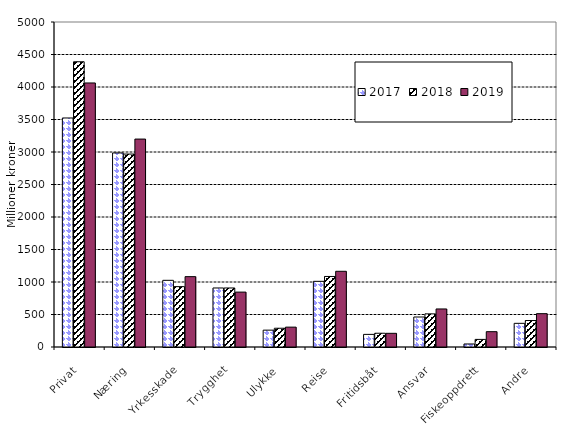
| Category | 2017 | 2018 | 2019 |
|---|---|---|---|
| Privat | 3523.339 | 4388.265 | 4062.098 |
| Næring | 2985.487 | 2968.497 | 3198.952 |
| Yrkesskade | 1025.826 | 928.785 | 1082.429 |
| Trygghet | 908.118 | 908.027 | 844.528 |
| Ulykke | 259.137 | 288.488 | 305.606 |
| Reise | 1010.192 | 1085.106 | 1164.677 |
| Fritidsbåt | 194.097 | 211.627 | 210.512 |
| Ansvar | 461.433 | 509.757 | 585.276 |
| Fiskeoppdrett | 46.489 | 116.933 | 235.673 |
| Andre | 363.98 | 407.531 | 512.817 |